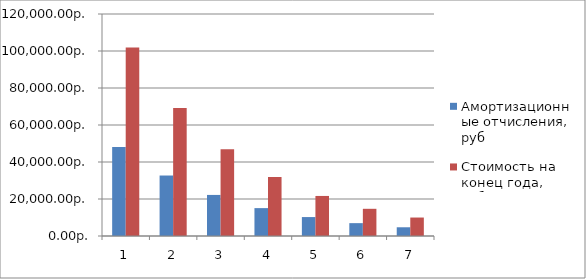
| Category | Амортизационные отчисления, руб | Стоимость на конец года, руб |
|---|---|---|
| 0 | 48150 | 101850 |
| 1 | 32693.85 | 69156.15 |
| 2 | 22199.124 | 46957.026 |
| 3 | 15073.205 | 31883.821 |
| 4 | 10234.706 | 21649.114 |
| 5 | 6949.366 | 14699.749 |
| 6 | 4718.619 | 9981.129 |